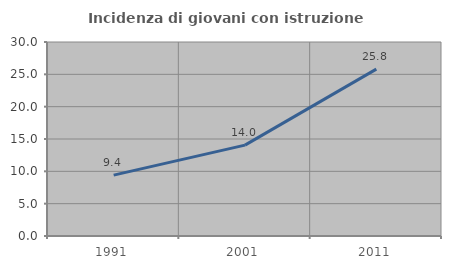
| Category | Incidenza di giovani con istruzione universitaria |
|---|---|
| 1991.0 | 9.412 |
| 2001.0 | 14.05 |
| 2011.0 | 25.806 |